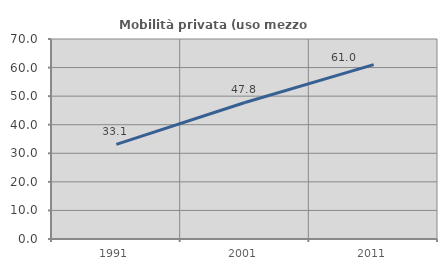
| Category | Mobilità privata (uso mezzo privato) |
|---|---|
| 1991.0 | 33.103 |
| 2001.0 | 47.791 |
| 2011.0 | 61.017 |